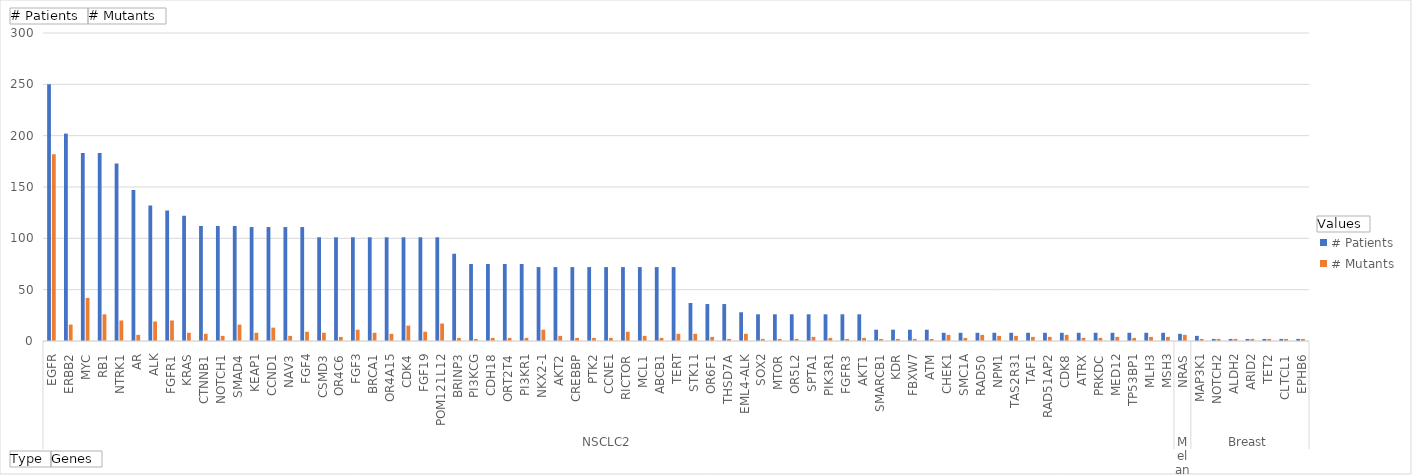
| Category | # Patients | # Mutants |
|---|---|---|
| 0 | 250 | 182 |
| 1 | 202 | 16 |
| 2 | 183 | 42 |
| 3 | 183 | 26 |
| 4 | 173 | 20 |
| 5 | 147 | 6 |
| 6 | 132 | 19 |
| 7 | 127 | 20 |
| 8 | 122 | 8 |
| 9 | 112 | 7 |
| 10 | 112 | 5 |
| 11 | 112 | 16 |
| 12 | 111 | 8 |
| 13 | 111 | 13 |
| 14 | 111 | 5 |
| 15 | 111 | 9 |
| 16 | 101 | 8 |
| 17 | 101 | 4 |
| 18 | 101 | 11 |
| 19 | 101 | 8 |
| 20 | 101 | 7 |
| 21 | 101 | 15 |
| 22 | 101 | 9 |
| 23 | 101 | 17 |
| 24 | 85 | 3 |
| 25 | 75 | 2 |
| 26 | 75 | 3 |
| 27 | 75 | 3 |
| 28 | 75 | 3 |
| 29 | 72 | 11 |
| 30 | 72 | 5 |
| 31 | 72 | 3 |
| 32 | 72 | 3 |
| 33 | 72 | 3 |
| 34 | 72 | 9 |
| 35 | 72 | 5 |
| 36 | 72 | 3 |
| 37 | 72 | 7 |
| 38 | 37 | 7 |
| 39 | 36 | 4 |
| 40 | 36 | 2 |
| 41 | 28 | 7 |
| 42 | 26 | 2 |
| 43 | 26 | 2 |
| 44 | 26 | 2 |
| 45 | 26 | 4 |
| 46 | 26 | 3 |
| 47 | 26 | 2 |
| 48 | 26 | 3 |
| 49 | 11 | 2 |
| 50 | 11 | 2 |
| 51 | 11 | 2 |
| 52 | 11 | 2 |
| 53 | 8 | 6 |
| 54 | 8 | 3 |
| 55 | 8 | 6 |
| 56 | 8 | 5 |
| 57 | 8 | 5 |
| 58 | 8 | 4 |
| 59 | 8 | 4 |
| 60 | 8 | 6 |
| 61 | 8 | 3 |
| 62 | 8 | 3 |
| 63 | 8 | 4 |
| 64 | 8 | 3 |
| 65 | 8 | 4 |
| 66 | 8 | 4 |
| 67 | 7 | 6 |
| 68 | 5 | 2 |
| 69 | 2 | 2 |
| 70 | 2 | 2 |
| 71 | 2 | 2 |
| 72 | 2 | 2 |
| 73 | 2 | 2 |
| 74 | 2 | 2 |